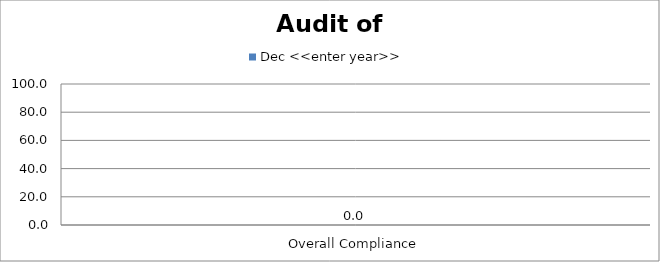
| Category | Dec <<enter year>> |
|---|---|
| Overall Compliance | 0 |